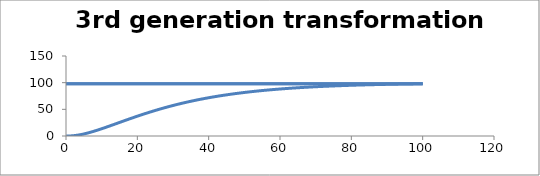
| Category | C - Sys 4 |
|---|---|
| 0.1 | 0 |
| 0.2 | 0 |
| 0.3 | 0.001 |
| 0.4 | 0.004 |
| 0.5 | 0.009 |
| 0.6 | 0.016 |
| 0.7000000000000001 | 0.027 |
| 0.8 | 0.04 |
| 0.9000000000000001 | 0.057 |
| 1.0 | 0.078 |
| 1.0999999999999999 | 0.103 |
| 1.2 | 0.131 |
| 1.3 | 0.163 |
| 1.4000000000000001 | 0.199 |
| 1.5 | 0.239 |
| 1.6 | 0.283 |
| 1.7000000000000002 | 0.331 |
| 1.8000000000000003 | 0.383 |
| 1.9 | 0.439 |
| 2.0 | 0.498 |
| 2.1 | 0.562 |
| 2.1999999999999997 | 0.629 |
| 2.3 | 0.7 |
| 2.4 | 0.774 |
| 2.5 | 0.852 |
| 2.6 | 0.934 |
| 2.7 | 1.019 |
| 2.8000000000000003 | 1.107 |
| 2.9000000000000004 | 1.199 |
| 3.0 | 1.295 |
| 3.1 | 1.393 |
| 3.2 | 1.495 |
| 3.3000000000000003 | 1.6 |
| 3.4000000000000004 | 1.708 |
| 3.5000000000000004 | 1.82 |
| 3.6000000000000005 | 1.934 |
| 3.6999999999999997 | 2.051 |
| 3.8 | 2.172 |
| 3.9 | 2.295 |
| 4.0 | 2.421 |
| 4.1000000000000005 | 2.549 |
| 4.2 | 2.681 |
| 4.300000000000001 | 2.815 |
| 4.3999999999999995 | 2.952 |
| 4.5 | 3.091 |
| 4.6 | 3.233 |
| 4.7 | 3.378 |
| 4.8 | 3.525 |
| 4.9 | 3.674 |
| 5.0 | 3.826 |
| 5.1000000000000005 | 3.98 |
| 5.2 | 4.136 |
| 5.3 | 4.295 |
| 5.4 | 4.455 |
| 5.5 | 4.618 |
| 5.6000000000000005 | 4.783 |
| 5.7 | 4.95 |
| 5.800000000000001 | 5.119 |
| 5.9 | 5.291 |
| 6.0 | 5.464 |
| 6.1 | 5.639 |
| 6.2 | 5.816 |
| 6.3 | 5.994 |
| 6.4 | 6.175 |
| 6.5 | 6.357 |
| 6.6000000000000005 | 6.541 |
| 6.7 | 6.727 |
| 6.800000000000001 | 6.915 |
| 6.9 | 7.104 |
| 7.000000000000001 | 7.294 |
| 7.1000000000000005 | 7.487 |
| 7.200000000000001 | 7.68 |
| 7.3 | 7.876 |
| 7.3999999999999995 | 8.072 |
| 7.5 | 8.271 |
| 7.6 | 8.47 |
| 7.7 | 8.671 |
| 7.8 | 8.873 |
| 7.9 | 9.077 |
| 8.0 | 9.282 |
| 8.1 | 9.488 |
| 8.200000000000001 | 9.695 |
| 8.3 | 9.904 |
| 8.4 | 10.114 |
| 8.5 | 10.324 |
| 8.600000000000001 | 10.536 |
| 8.700000000000001 | 10.749 |
| 8.799999999999999 | 10.964 |
| 8.9 | 11.179 |
| 9.0 | 11.395 |
| 9.1 | 11.612 |
| 9.2 | 11.83 |
| 9.3 | 12.049 |
| 9.4 | 12.269 |
| 9.5 | 12.49 |
| 9.6 | 12.711 |
| 9.700000000000001 | 12.934 |
| 9.8 | 13.157 |
| 9.9 | 13.381 |
| 10.0 | 13.606 |
| 10.100000000000001 | 13.832 |
| 10.200000000000001 | 14.058 |
| 10.3 | 14.285 |
| 10.4 | 14.512 |
| 10.5 | 14.741 |
| 10.6 | 14.97 |
| 10.7 | 15.199 |
| 10.8 | 15.429 |
| 10.9 | 15.66 |
| 11.0 | 15.891 |
| 11.1 | 16.123 |
| 11.200000000000001 | 16.355 |
| 11.3 | 16.588 |
| 11.4 | 16.821 |
| 11.5 | 17.055 |
| 11.600000000000001 | 17.289 |
| 11.700000000000001 | 17.524 |
| 11.8 | 17.759 |
| 11.9 | 17.994 |
| 12.0 | 18.23 |
| 12.1 | 18.466 |
| 12.2 | 18.702 |
| 12.3 | 18.939 |
| 12.4 | 19.176 |
| 12.5 | 19.414 |
| 12.6 | 19.651 |
| 12.7 | 19.889 |
| 12.8 | 20.127 |
| 12.9 | 20.365 |
| 13.0 | 20.604 |
| 13.100000000000001 | 20.843 |
| 13.200000000000001 | 21.081 |
| 13.3 | 21.32 |
| 13.4 | 21.56 |
| 13.5 | 21.799 |
| 13.600000000000001 | 22.038 |
| 13.700000000000001 | 22.278 |
| 13.8 | 22.518 |
| 13.900000000000002 | 22.757 |
| 14.000000000000002 | 22.997 |
| 14.100000000000001 | 23.237 |
| 14.200000000000001 | 23.477 |
| 14.3 | 23.717 |
| 14.400000000000002 | 23.957 |
| 14.499999999999998 | 24.197 |
| 14.6 | 24.437 |
| 14.7 | 24.677 |
| 14.799999999999999 | 24.917 |
| 14.899999999999999 | 25.156 |
| 15.0 | 25.396 |
| 15.1 | 25.636 |
| 15.2 | 25.876 |
| 15.299999999999999 | 26.115 |
| 15.4 | 26.355 |
| 15.5 | 26.594 |
| 15.6 | 26.834 |
| 15.7 | 27.073 |
| 15.8 | 27.312 |
| 15.9 | 27.551 |
| 16.0 | 27.79 |
| 16.1 | 28.028 |
| 16.2 | 28.267 |
| 16.3 | 28.505 |
| 16.400000000000002 | 28.743 |
| 16.5 | 28.981 |
| 16.6 | 29.219 |
| 16.7 | 29.456 |
| 16.8 | 29.694 |
| 16.900000000000002 | 29.931 |
| 17.0 | 30.167 |
| 17.1 | 30.404 |
| 17.200000000000003 | 30.64 |
| 17.3 | 30.876 |
| 17.400000000000002 | 31.112 |
| 17.5 | 31.348 |
| 17.599999999999998 | 31.583 |
| 17.7 | 31.818 |
| 17.8 | 32.053 |
| 17.9 | 32.287 |
| 18.0 | 32.521 |
| 18.099999999999998 | 32.755 |
| 18.2 | 32.988 |
| 18.3 | 33.221 |
| 18.4 | 33.454 |
| 18.5 | 33.686 |
| 18.6 | 33.918 |
| 18.7 | 34.15 |
| 18.8 | 34.382 |
| 18.9 | 34.613 |
| 19.0 | 34.843 |
| 19.1 | 35.073 |
| 19.2 | 35.303 |
| 19.3 | 35.533 |
| 19.400000000000002 | 35.762 |
| 19.5 | 35.991 |
| 19.6 | 36.219 |
| 19.7 | 36.447 |
| 19.8 | 36.674 |
| 19.900000000000002 | 36.901 |
| 20.0 | 37.128 |
| 20.1 | 37.354 |
| 20.200000000000003 | 37.58 |
| 20.3 | 37.805 |
| 20.400000000000002 | 38.03 |
| 20.5 | 38.255 |
| 20.6 | 38.479 |
| 20.700000000000003 | 38.703 |
| 20.8 | 38.926 |
| 20.9 | 39.148 |
| 21.0 | 39.371 |
| 21.099999999999998 | 39.592 |
| 21.2 | 39.814 |
| 21.3 | 40.034 |
| 21.4 | 40.255 |
| 21.5 | 40.475 |
| 21.6 | 40.694 |
| 21.7 | 40.913 |
| 21.8 | 41.131 |
| 21.9 | 41.349 |
| 22.0 | 41.567 |
| 22.1 | 41.784 |
| 22.2 | 42 |
| 22.3 | 42.216 |
| 22.400000000000002 | 42.431 |
| 22.5 | 42.646 |
| 22.6 | 42.861 |
| 22.7 | 43.075 |
| 22.8 | 43.288 |
| 22.900000000000002 | 43.501 |
| 23.0 | 43.713 |
| 23.1 | 43.925 |
| 23.200000000000003 | 44.136 |
| 23.3 | 44.347 |
| 23.400000000000002 | 44.557 |
| 23.5 | 44.767 |
| 23.6 | 44.976 |
| 23.700000000000003 | 45.185 |
| 23.8 | 45.393 |
| 23.900000000000002 | 45.6 |
| 24.0 | 45.807 |
| 24.099999999999998 | 46.014 |
| 24.2 | 46.22 |
| 24.3 | 46.425 |
| 24.4 | 46.63 |
| 24.5 | 46.834 |
| 24.6 | 47.038 |
| 24.7 | 47.241 |
| 24.8 | 47.444 |
| 24.9 | 47.646 |
| 25.0 | 47.847 |
| 25.1 | 48.048 |
| 25.2 | 48.249 |
| 25.3 | 48.449 |
| 25.4 | 48.648 |
| 25.5 | 48.846 |
| 25.6 | 49.045 |
| 25.7 | 49.242 |
| 25.8 | 49.439 |
| 25.900000000000002 | 49.636 |
| 26.0 | 49.832 |
| 26.1 | 50.027 |
| 26.200000000000003 | 50.222 |
| 26.3 | 50.416 |
| 26.400000000000002 | 50.609 |
| 26.5 | 50.802 |
| 26.6 | 50.995 |
| 26.700000000000003 | 51.187 |
| 26.8 | 51.378 |
| 26.900000000000002 | 51.569 |
| 27.0 | 51.759 |
| 27.1 | 51.949 |
| 27.200000000000003 | 52.138 |
| 27.3 | 52.326 |
| 27.400000000000002 | 52.514 |
| 27.500000000000004 | 52.701 |
| 27.6 | 52.888 |
| 27.700000000000003 | 53.074 |
| 27.800000000000004 | 53.26 |
| 27.900000000000002 | 53.445 |
| 28.000000000000004 | 53.629 |
| 28.1 | 53.813 |
| 28.200000000000003 | 53.996 |
| 28.300000000000004 | 54.179 |
| 28.400000000000002 | 54.361 |
| 28.500000000000004 | 54.543 |
| 28.6 | 54.724 |
| 28.700000000000003 | 54.904 |
| 28.800000000000004 | 55.084 |
| 28.9 | 55.263 |
| 28.999999999999996 | 55.442 |
| 29.099999999999998 | 55.62 |
| 29.2 | 55.797 |
| 29.299999999999997 | 55.974 |
| 29.4 | 56.151 |
| 29.5 | 56.327 |
| 29.599999999999998 | 56.502 |
| 29.7 | 56.676 |
| 29.799999999999997 | 56.851 |
| 29.9 | 57.024 |
| 30.0 | 57.197 |
| 30.099999999999998 | 57.369 |
| 30.2 | 57.541 |
| 30.3 | 57.712 |
| 30.4 | 57.883 |
| 30.5 | 58.053 |
| 30.599999999999998 | 58.222 |
| 30.7 | 58.391 |
| 30.8 | 58.56 |
| 30.9 | 58.728 |
| 31.0 | 58.895 |
| 31.1 | 59.061 |
| 31.2 | 59.228 |
| 31.3 | 59.393 |
| 31.4 | 59.558 |
| 31.5 | 59.722 |
| 31.6 | 59.886 |
| 31.7 | 60.049 |
| 31.8 | 60.212 |
| 31.900000000000002 | 60.374 |
| 32.0 | 60.536 |
| 32.1 | 60.697 |
| 32.2 | 60.857 |
| 32.300000000000004 | 61.017 |
| 32.4 | 61.177 |
| 32.5 | 61.335 |
| 32.6 | 61.494 |
| 32.7 | 61.651 |
| 32.800000000000004 | 61.808 |
| 32.9 | 61.965 |
| 33.0 | 62.121 |
| 33.1 | 62.276 |
| 33.2 | 62.431 |
| 33.300000000000004 | 62.586 |
| 33.4 | 62.739 |
| 33.5 | 62.893 |
| 33.6 | 63.045 |
| 33.7 | 63.198 |
| 33.800000000000004 | 63.349 |
| 33.900000000000006 | 63.5 |
| 34.0 | 63.651 |
| 34.1 | 63.801 |
| 34.2 | 63.95 |
| 34.300000000000004 | 64.099 |
| 34.400000000000006 | 64.247 |
| 34.5 | 64.395 |
| 34.6 | 64.543 |
| 34.7 | 64.689 |
| 34.800000000000004 | 64.835 |
| 34.900000000000006 | 64.981 |
| 35.0 | 65.126 |
| 35.1 | 65.271 |
| 35.199999999999996 | 65.415 |
| 35.3 | 65.559 |
| 35.4 | 65.702 |
| 35.5 | 65.844 |
| 35.6 | 65.986 |
| 35.699999999999996 | 66.128 |
| 35.8 | 66.268 |
| 35.9 | 66.409 |
| 36.0 | 66.549 |
| 36.1 | 66.688 |
| 36.199999999999996 | 66.827 |
| 36.3 | 66.965 |
| 36.4 | 67.103 |
| 36.5 | 67.24 |
| 36.6 | 67.377 |
| 36.7 | 67.513 |
| 36.8 | 67.649 |
| 36.9 | 67.784 |
| 37.0 | 67.919 |
| 37.1 | 68.053 |
| 37.2 | 68.187 |
| 37.3 | 68.32 |
| 37.4 | 68.453 |
| 37.5 | 68.585 |
| 37.6 | 68.717 |
| 37.7 | 68.848 |
| 37.8 | 68.979 |
| 37.9 | 69.109 |
| 38.0 | 69.239 |
| 38.1 | 69.368 |
| 38.2 | 69.497 |
| 38.3 | 69.625 |
| 38.4 | 69.753 |
| 38.5 | 69.88 |
| 38.6 | 70.007 |
| 38.7 | 70.133 |
| 38.800000000000004 | 70.259 |
| 38.9 | 70.384 |
| 39.0 | 70.509 |
| 39.1 | 70.633 |
| 39.2 | 70.757 |
| 39.300000000000004 | 70.881 |
| 39.4 | 71.004 |
| 39.5 | 71.126 |
| 39.6 | 71.248 |
| 39.7 | 71.37 |
| 39.800000000000004 | 71.491 |
| 39.900000000000006 | 71.611 |
| 40.0 | 71.731 |
| 40.1 | 71.851 |
| 40.2 | 71.97 |
| 40.300000000000004 | 72.089 |
| 40.400000000000006 | 72.207 |
| 40.5 | 72.325 |
| 40.6 | 72.442 |
| 40.7 | 72.559 |
| 40.800000000000004 | 72.675 |
| 40.900000000000006 | 72.791 |
| 41.0 | 72.907 |
| 41.1 | 73.022 |
| 41.2 | 73.136 |
| 41.300000000000004 | 73.25 |
| 41.400000000000006 | 73.364 |
| 41.5 | 73.477 |
| 41.6 | 73.59 |
| 41.699999999999996 | 73.702 |
| 41.8 | 73.814 |
| 41.9 | 73.925 |
| 42.0 | 74.036 |
| 42.1 | 74.147 |
| 42.199999999999996 | 74.257 |
| 42.3 | 74.367 |
| 42.4 | 74.476 |
| 42.5 | 74.585 |
| 42.6 | 74.693 |
| 42.699999999999996 | 74.801 |
| 42.8 | 74.909 |
| 42.9 | 75.016 |
| 43.0 | 75.122 |
| 43.1 | 75.228 |
| 43.2 | 75.334 |
| 43.3 | 75.44 |
| 43.4 | 75.545 |
| 43.5 | 75.649 |
| 43.6 | 75.753 |
| 43.7 | 75.857 |
| 43.8 | 75.96 |
| 43.9 | 76.063 |
| 44.0 | 76.165 |
| 44.1 | 76.268 |
| 44.2 | 76.369 |
| 44.3 | 76.47 |
| 44.4 | 76.571 |
| 44.5 | 76.672 |
| 44.6 | 76.771 |
| 44.7 | 76.871 |
| 44.800000000000004 | 76.97 |
| 44.9 | 77.069 |
| 45.0 | 77.167 |
| 45.1 | 77.265 |
| 45.2 | 77.363 |
| 45.300000000000004 | 77.46 |
| 45.4 | 77.557 |
| 45.5 | 77.653 |
| 45.6 | 77.749 |
| 45.7 | 77.845 |
| 45.800000000000004 | 77.94 |
| 45.9 | 78.035 |
| 46.0 | 78.129 |
| 46.1 | 78.223 |
| 46.2 | 78.317 |
| 46.300000000000004 | 78.41 |
| 46.400000000000006 | 78.503 |
| 46.5 | 78.596 |
| 46.6 | 78.688 |
| 46.7 | 78.78 |
| 46.800000000000004 | 78.871 |
| 46.900000000000006 | 78.962 |
| 47.0 | 79.053 |
| 47.1 | 79.143 |
| 47.2 | 79.233 |
| 47.300000000000004 | 79.323 |
| 47.400000000000006 | 79.412 |
| 47.5 | 79.501 |
| 47.6 | 79.589 |
| 47.7 | 79.677 |
| 47.800000000000004 | 79.765 |
| 47.900000000000006 | 79.852 |
| 48.0 | 79.939 |
| 48.1 | 80.026 |
| 48.199999999999996 | 80.112 |
| 48.3 | 80.198 |
| 48.4 | 80.283 |
| 48.5 | 80.369 |
| 48.6 | 80.454 |
| 48.699999999999996 | 80.538 |
| 48.8 | 80.622 |
| 48.9 | 80.706 |
| 49.0 | 80.789 |
| 49.1 | 80.873 |
| 49.2 | 80.955 |
| 49.3 | 81.038 |
| 49.4 | 81.12 |
| 49.5 | 81.202 |
| 49.6 | 81.283 |
| 49.7 | 81.364 |
| 49.8 | 81.445 |
| 49.9 | 81.525 |
| 50.0 | 81.605 |
| 50.1 | 81.685 |
| 50.2 | 81.764 |
| 50.3 | 81.843 |
| 50.4 | 81.922 |
| 50.5 | 82 |
| 50.6 | 82.078 |
| 50.7 | 82.156 |
| 50.8 | 82.234 |
| 50.9 | 82.311 |
| 51.0 | 82.387 |
| 51.1 | 82.464 |
| 51.2 | 82.54 |
| 51.300000000000004 | 82.616 |
| 51.4 | 82.691 |
| 51.5 | 82.767 |
| 51.6 | 82.841 |
| 51.7 | 82.916 |
| 51.800000000000004 | 82.99 |
| 51.9 | 83.064 |
| 52.0 | 83.138 |
| 52.1 | 83.211 |
| 52.2 | 83.284 |
| 52.300000000000004 | 83.357 |
| 52.400000000000006 | 83.429 |
| 52.5 | 83.501 |
| 52.6 | 83.573 |
| 52.7 | 83.644 |
| 52.800000000000004 | 83.716 |
| 52.900000000000006 | 83.786 |
| 53.0 | 83.857 |
| 53.1 | 83.927 |
| 53.2 | 83.997 |
| 53.300000000000004 | 84.067 |
| 53.400000000000006 | 84.136 |
| 53.5 | 84.205 |
| 53.6 | 84.274 |
| 53.7 | 84.343 |
| 53.800000000000004 | 84.411 |
| 53.900000000000006 | 84.479 |
| 54.0 | 84.546 |
| 54.1 | 84.614 |
| 54.2 | 84.681 |
| 54.300000000000004 | 84.748 |
| 54.400000000000006 | 84.814 |
| 54.50000000000001 | 84.88 |
| 54.6 | 84.946 |
| 54.7 | 85.012 |
| 54.800000000000004 | 85.077 |
| 54.900000000000006 | 85.142 |
| 55.00000000000001 | 85.207 |
| 55.1 | 85.272 |
| 55.2 | 85.336 |
| 55.300000000000004 | 85.4 |
| 55.400000000000006 | 85.464 |
| 55.50000000000001 | 85.527 |
| 55.60000000000001 | 85.591 |
| 55.7 | 85.653 |
| 55.800000000000004 | 85.716 |
| 55.900000000000006 | 85.779 |
| 56.00000000000001 | 85.841 |
| 56.10000000000001 | 85.903 |
| 56.2 | 85.964 |
| 56.300000000000004 | 86.025 |
| 56.400000000000006 | 86.087 |
| 56.50000000000001 | 86.147 |
| 56.60000000000001 | 86.208 |
| 56.7 | 86.268 |
| 56.800000000000004 | 86.328 |
| 56.900000000000006 | 86.388 |
| 57.00000000000001 | 86.448 |
| 57.10000000000001 | 86.507 |
| 57.2 | 86.566 |
| 57.300000000000004 | 86.625 |
| 57.400000000000006 | 86.683 |
| 57.50000000000001 | 86.741 |
| 57.60000000000001 | 86.799 |
| 57.699999999999996 | 86.857 |
| 57.8 | 86.915 |
| 57.9 | 86.972 |
| 57.99999999999999 | 87.029 |
| 58.099999999999994 | 87.086 |
| 58.199999999999996 | 87.142 |
| 58.3 | 87.199 |
| 58.4 | 87.255 |
| 58.5 | 87.31 |
| 58.599999999999994 | 87.366 |
| 58.699999999999996 | 87.421 |
| 58.8 | 87.476 |
| 58.9 | 87.531 |
| 59.0 | 87.586 |
| 59.099999999999994 | 87.64 |
| 59.199999999999996 | 87.695 |
| 59.3 | 87.748 |
| 59.4 | 87.802 |
| 59.5 | 87.856 |
| 59.599999999999994 | 87.909 |
| 59.699999999999996 | 87.962 |
| 59.8 | 88.015 |
| 59.9 | 88.067 |
| 60.0 | 88.12 |
| 60.099999999999994 | 88.172 |
| 60.199999999999996 | 88.224 |
| 60.3 | 88.275 |
| 60.4 | 88.327 |
| 60.5 | 88.378 |
| 60.6 | 88.429 |
| 60.699999999999996 | 88.48 |
| 60.8 | 88.53 |
| 60.9 | 88.58 |
| 61.0 | 88.631 |
| 61.1 | 88.681 |
| 61.199999999999996 | 88.73 |
| 61.3 | 88.78 |
| 61.4 | 88.829 |
| 61.5 | 88.878 |
| 61.6 | 88.927 |
| 61.7 | 88.975 |
| 61.8 | 89.024 |
| 61.9 | 89.072 |
| 62.0 | 89.12 |
| 62.1 | 89.168 |
| 62.2 | 89.215 |
| 62.3 | 89.263 |
| 62.4 | 89.31 |
| 62.5 | 89.357 |
| 62.6 | 89.404 |
| 62.7 | 89.45 |
| 62.8 | 89.497 |
| 62.9 | 89.543 |
| 63.0 | 89.589 |
| 63.1 | 89.635 |
| 63.2 | 89.68 |
| 63.3 | 89.725 |
| 63.4 | 89.771 |
| 63.5 | 89.816 |
| 63.6 | 89.86 |
| 63.7 | 89.905 |
| 63.800000000000004 | 89.949 |
| 63.9 | 89.994 |
| 64.0 | 90.038 |
| 64.1 | 90.081 |
| 64.2 | 90.125 |
| 64.3 | 90.168 |
| 64.4 | 90.212 |
| 64.5 | 90.255 |
| 64.60000000000001 | 90.298 |
| 64.7 | 90.34 |
| 64.8 | 90.383 |
| 64.9 | 90.425 |
| 65.0 | 90.467 |
| 65.10000000000001 | 90.509 |
| 65.2 | 90.551 |
| 65.3 | 90.593 |
| 65.4 | 90.634 |
| 65.5 | 90.675 |
| 65.60000000000001 | 90.716 |
| 65.7 | 90.757 |
| 65.8 | 90.798 |
| 65.9 | 90.838 |
| 66.0 | 90.879 |
| 66.10000000000001 | 90.919 |
| 66.2 | 90.959 |
| 66.3 | 90.999 |
| 66.4 | 91.038 |
| 66.5 | 91.078 |
| 66.60000000000001 | 91.117 |
| 66.7 | 91.156 |
| 66.8 | 91.195 |
| 66.9 | 91.234 |
| 67.0 | 91.273 |
| 67.10000000000001 | 91.311 |
| 67.2 | 91.349 |
| 67.30000000000001 | 91.388 |
| 67.4 | 91.425 |
| 67.5 | 91.463 |
| 67.60000000000001 | 91.501 |
| 67.7 | 91.538 |
| 67.80000000000001 | 91.576 |
| 67.9 | 91.613 |
| 68.0 | 91.65 |
| 68.10000000000001 | 91.687 |
| 68.2 | 91.723 |
| 68.30000000000001 | 91.76 |
| 68.4 | 91.796 |
| 68.5 | 91.832 |
| 68.60000000000001 | 91.868 |
| 68.7 | 91.904 |
| 68.80000000000001 | 91.94 |
| 68.9 | 91.975 |
| 69.0 | 92.011 |
| 69.10000000000001 | 92.046 |
| 69.2 | 92.081 |
| 69.30000000000001 | 92.116 |
| 69.4 | 92.151 |
| 69.5 | 92.185 |
| 69.60000000000001 | 92.22 |
| 69.7 | 92.254 |
| 69.80000000000001 | 92.288 |
| 69.9 | 92.322 |
| 70.0 | 92.356 |
| 70.10000000000001 | 92.39 |
| 70.2 | 92.424 |
| 70.30000000000001 | 92.457 |
| 70.39999999999999 | 92.49 |
| 70.5 | 92.523 |
| 70.6 | 92.556 |
| 70.7 | 92.589 |
| 70.8 | 92.622 |
| 70.89999999999999 | 92.655 |
| 71.0 | 92.687 |
| 71.1 | 92.719 |
| 71.2 | 92.751 |
| 71.3 | 92.783 |
| 71.39999999999999 | 92.815 |
| 71.5 | 92.847 |
| 71.6 | 92.879 |
| 71.7 | 92.91 |
| 71.8 | 92.941 |
| 71.89999999999999 | 92.972 |
| 72.0 | 93.003 |
| 72.1 | 93.034 |
| 72.2 | 93.065 |
| 72.3 | 93.096 |
| 72.39999999999999 | 93.126 |
| 72.5 | 93.157 |
| 72.6 | 93.187 |
| 72.7 | 93.217 |
| 72.8 | 93.247 |
| 72.89999999999999 | 93.277 |
| 73.0 | 93.306 |
| 73.1 | 93.336 |
| 73.2 | 93.365 |
| 73.3 | 93.395 |
| 73.4 | 93.424 |
| 73.5 | 93.453 |
| 73.6 | 93.482 |
| 73.7 | 93.511 |
| 73.8 | 93.539 |
| 73.9 | 93.568 |
| 74.0 | 93.596 |
| 74.1 | 93.625 |
| 74.2 | 93.653 |
| 74.3 | 93.681 |
| 74.4 | 93.709 |
| 74.5 | 93.737 |
| 74.6 | 93.764 |
| 74.7 | 93.792 |
| 74.8 | 93.819 |
| 74.9 | 93.847 |
| 75.0 | 93.874 |
| 75.1 | 93.901 |
| 75.2 | 93.928 |
| 75.3 | 93.955 |
| 75.4 | 93.981 |
| 75.5 | 94.008 |
| 75.6 | 94.034 |
| 75.7 | 94.061 |
| 75.8 | 94.087 |
| 75.9 | 94.113 |
| 76.0 | 94.139 |
| 76.1 | 94.165 |
| 76.2 | 94.191 |
| 76.3 | 94.217 |
| 76.4 | 94.242 |
| 76.5 | 94.268 |
| 76.6 | 94.293 |
| 76.7 | 94.318 |
| 76.8 | 94.343 |
| 76.9 | 94.368 |
| 77.0 | 94.393 |
| 77.10000000000001 | 94.418 |
| 77.2 | 94.443 |
| 77.3 | 94.467 |
| 77.4 | 94.492 |
| 77.5 | 94.516 |
| 77.60000000000001 | 94.54 |
| 77.7 | 94.565 |
| 77.8 | 94.589 |
| 77.9 | 94.613 |
| 78.0 | 94.636 |
| 78.10000000000001 | 94.66 |
| 78.2 | 94.684 |
| 78.3 | 94.707 |
| 78.4 | 94.731 |
| 78.5 | 94.754 |
| 78.60000000000001 | 94.777 |
| 78.7 | 94.8 |
| 78.8 | 94.823 |
| 78.9 | 94.846 |
| 79.0 | 94.869 |
| 79.10000000000001 | 94.892 |
| 79.2 | 94.914 |
| 79.3 | 94.937 |
| 79.4 | 94.959 |
| 79.5 | 94.982 |
| 79.60000000000001 | 95.004 |
| 79.7 | 95.026 |
| 79.80000000000001 | 95.048 |
| 79.9 | 95.07 |
| 80.0 | 95.092 |
| 80.10000000000001 | 95.113 |
| 80.2 | 95.135 |
| 80.30000000000001 | 95.157 |
| 80.4 | 95.178 |
| 80.5 | 95.199 |
| 80.60000000000001 | 95.221 |
| 80.7 | 95.242 |
| 80.80000000000001 | 95.263 |
| 80.9 | 95.284 |
| 81.0 | 95.305 |
| 81.10000000000001 | 95.325 |
| 81.2 | 95.346 |
| 81.30000000000001 | 95.367 |
| 81.4 | 95.387 |
| 81.5 | 95.408 |
| 81.60000000000001 | 95.428 |
| 81.7 | 95.448 |
| 81.80000000000001 | 95.468 |
| 81.9 | 95.488 |
| 82.0 | 95.508 |
| 82.10000000000001 | 95.528 |
| 82.2 | 95.548 |
| 82.30000000000001 | 95.568 |
| 82.4 | 95.587 |
| 82.5 | 95.607 |
| 82.60000000000001 | 95.626 |
| 82.7 | 95.646 |
| 82.80000000000001 | 95.665 |
| 82.9 | 95.684 |
| 83.0 | 95.703 |
| 83.10000000000001 | 95.722 |
| 83.2 | 95.741 |
| 83.3 | 95.76 |
| 83.39999999999999 | 95.779 |
| 83.5 | 95.798 |
| 83.6 | 95.816 |
| 83.7 | 95.835 |
| 83.8 | 95.853 |
| 83.89999999999999 | 95.872 |
| 84.0 | 95.89 |
| 84.1 | 95.908 |
| 84.2 | 95.926 |
| 84.3 | 95.944 |
| 84.39999999999999 | 95.962 |
| 84.5 | 95.98 |
| 84.6 | 95.998 |
| 84.7 | 96.016 |
| 84.8 | 96.033 |
| 84.89999999999999 | 96.051 |
| 85.0 | 96.068 |
| 85.1 | 96.086 |
| 85.2 | 96.103 |
| 85.3 | 96.12 |
| 85.39999999999999 | 96.138 |
| 85.5 | 96.155 |
| 85.6 | 96.172 |
| 85.7 | 96.189 |
| 85.8 | 96.206 |
| 85.9 | 96.222 |
| 86.0 | 96.239 |
| 86.1 | 96.256 |
| 86.2 | 96.272 |
| 86.3 | 96.289 |
| 86.4 | 96.305 |
| 86.5 | 96.322 |
| 86.6 | 96.338 |
| 86.7 | 96.354 |
| 86.8 | 96.37 |
| 86.9 | 96.386 |
| 87.0 | 96.402 |
| 87.1 | 96.418 |
| 87.2 | 96.434 |
| 87.3 | 96.45 |
| 87.4 | 96.466 |
| 87.5 | 96.481 |
| 87.6 | 96.497 |
| 87.7 | 96.513 |
| 87.8 | 96.528 |
| 87.9 | 96.543 |
| 88.0 | 96.559 |
| 88.1 | 96.574 |
| 88.2 | 96.589 |
| 88.3 | 96.604 |
| 88.4 | 96.619 |
| 88.5 | 96.634 |
| 88.6 | 96.649 |
| 88.7 | 96.664 |
| 88.8 | 96.679 |
| 88.9 | 96.694 |
| 89.0 | 96.708 |
| 89.1 | 96.723 |
| 89.2 | 96.737 |
| 89.3 | 96.752 |
| 89.4 | 96.766 |
| 89.5 | 96.78 |
| 89.60000000000001 | 96.795 |
| 89.7 | 96.809 |
| 89.8 | 96.823 |
| 89.9 | 96.837 |
| 90.0 | 96.851 |
| 90.10000000000001 | 96.865 |
| 90.2 | 96.879 |
| 90.3 | 96.893 |
| 90.4 | 96.907 |
| 90.5 | 96.92 |
| 90.60000000000001 | 96.934 |
| 90.7 | 96.948 |
| 90.8 | 96.961 |
| 90.9 | 96.975 |
| 91.0 | 96.988 |
| 91.10000000000001 | 97.001 |
| 91.2 | 97.015 |
| 91.3 | 97.028 |
| 91.4 | 97.041 |
| 91.5 | 97.054 |
| 91.60000000000001 | 97.067 |
| 91.7 | 97.08 |
| 91.8 | 97.093 |
| 91.9 | 97.106 |
| 92.0 | 97.119 |
| 92.10000000000001 | 97.132 |
| 92.2 | 97.144 |
| 92.30000000000001 | 97.157 |
| 92.4 | 97.17 |
| 92.5 | 97.182 |
| 92.60000000000001 | 97.195 |
| 92.7 | 97.207 |
| 92.80000000000001 | 97.219 |
| 92.9 | 97.232 |
| 93.0 | 97.244 |
| 93.10000000000001 | 97.256 |
| 93.2 | 97.268 |
| 93.30000000000001 | 97.281 |
| 93.4 | 97.293 |
| 93.5 | 97.305 |
| 93.60000000000001 | 97.317 |
| 93.7 | 97.328 |
| 93.80000000000001 | 97.34 |
| 93.9 | 97.352 |
| 94.0 | 97.364 |
| 94.10000000000001 | 97.376 |
| 94.2 | 97.387 |
| 94.30000000000001 | 97.399 |
| 94.4 | 97.41 |
| 94.5 | 97.422 |
| 94.60000000000001 | 97.433 |
| 94.7 | 97.445 |
| 94.80000000000001 | 97.456 |
| 94.9 | 97.467 |
| 95.0 | 97.478 |
| 95.10000000000001 | 97.49 |
| 95.2 | 97.501 |
| 95.30000000000001 | 97.512 |
| 95.4 | 97.523 |
| 95.5 | 97.534 |
| 95.60000000000001 | 97.545 |
| 95.7 | 97.556 |
| 95.80000000000001 | 97.566 |
| 95.9 | 97.577 |
| 96.0 | 97.588 |
| 96.1 | 97.599 |
| 96.2 | 97.609 |
| 96.3 | 97.62 |
| 96.39999999999999 | 97.63 |
| 96.5 | 97.641 |
| 96.6 | 97.651 |
| 96.7 | 97.662 |
| 96.8 | 97.672 |
| 96.89999999999999 | 97.683 |
| 97.0 | 97.693 |
| 97.1 | 97.703 |
| 97.2 | 97.713 |
| 97.3 | 97.723 |
| 97.39999999999999 | 97.733 |
| 97.5 | 97.744 |
| 97.6 | 97.754 |
| 97.7 | 97.763 |
| 97.8 | 97.773 |
| 97.89999999999999 | 97.783 |
| 98.0 | 97.793 |
| 98.1 | 97.803 |
| 98.2 | 97.813 |
| 98.3 | 97.822 |
| 98.4 | 97.832 |
| 98.5 | 97.842 |
| 98.6 | 97.851 |
| 98.7 | 97.861 |
| 98.8 | 97.87 |
| 98.9 | 97.88 |
| 99.0 | 97.889 |
| 99.1 | 97.898 |
| 99.2 | 97.908 |
| 99.3 | 97.917 |
| 99.4 | 97.926 |
| 99.5 | 97.935 |
| 99.6 | 97.945 |
| 99.7 | 97.954 |
| 99.8 | 97.963 |
| 99.9 | 97.972 |
| 100.0 | 97.981 |